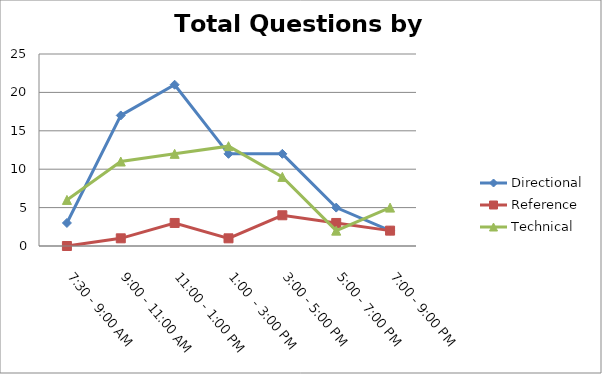
| Category | Directional | Reference | Technical |
|---|---|---|---|
| 7:30 - 9:00 AM | 3 | 0 | 6 |
| 9:00 - 11:00 AM | 17 | 1 | 11 |
| 11:00 - 1:00 PM | 21 | 3 | 12 |
| 1:00  - 3:00 PM | 12 | 1 | 13 |
| 3:00 - 5:00 PM | 12 | 4 | 9 |
| 5:00 - 7:00 PM | 5 | 3 | 2 |
| 7:00 - 9:00 PM | 2 | 2 | 5 |